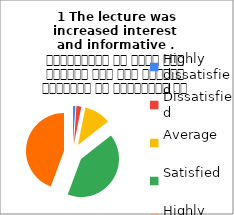
| Category | 1 The lecture was
increased interest  and informative .  व्याख्यान से रुचि में वृद्धि हुई एवं शिक्षण जानकारी से परिपूर्ण था |
|---|---|
| Highly dissatisfied | 1 |
| Dissatisfied | 2 |
| Average | 11 |
| Satisfied | 40 |
| Highly satisfied | 43 |